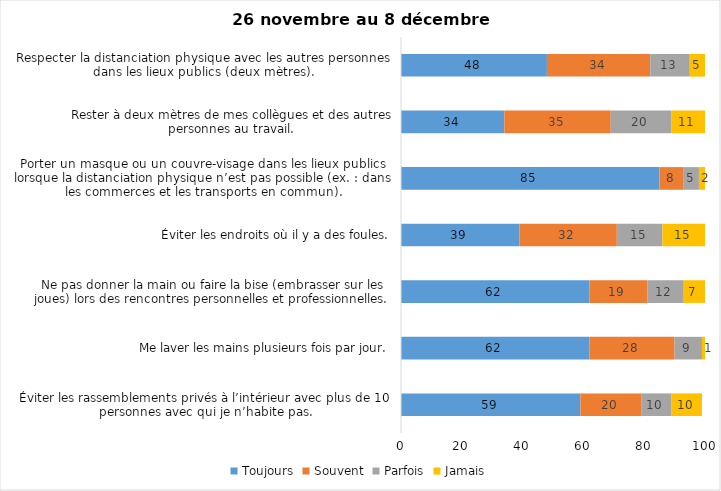
| Category | Toujours | Souvent | Parfois | Jamais |
|---|---|---|---|---|
| Éviter les rassemblements privés à l’intérieur avec plus de 10 personnes avec qui je n’habite pas. | 59 | 20 | 10 | 10 |
| Me laver les mains plusieurs fois par jour. | 62 | 28 | 9 | 1 |
| Ne pas donner la main ou faire la bise (embrasser sur les joues) lors des rencontres personnelles et professionnelles. | 62 | 19 | 12 | 7 |
| Éviter les endroits où il y a des foules. | 39 | 32 | 15 | 15 |
| Porter un masque ou un couvre-visage dans les lieux publics lorsque la distanciation physique n’est pas possible (ex. : dans les commerces et les transports en commun). | 85 | 8 | 5 | 2 |
| Rester à deux mètres de mes collègues et des autres personnes au travail. | 34 | 35 | 20 | 11 |
| Respecter la distanciation physique avec les autres personnes dans les lieux publics (deux mètres). | 48 | 34 | 13 | 5 |